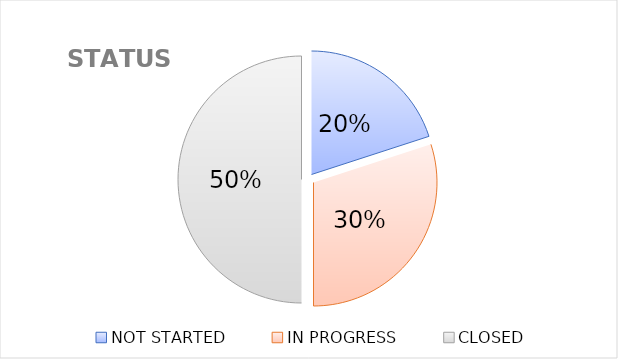
| Category | Series 0 |
|---|---|
| NOT STARTED | 2 |
| IN PROGRESS | 3 |
| CLOSED | 5 |